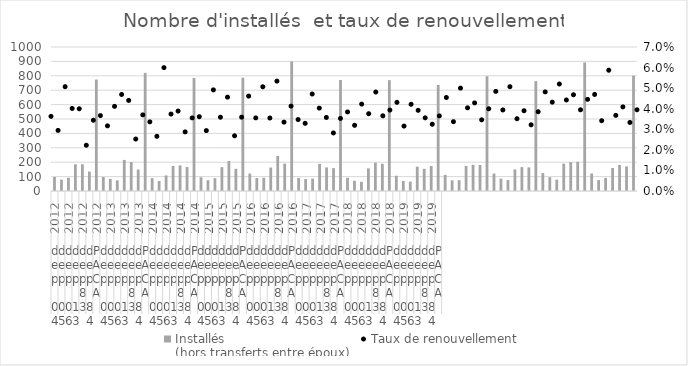
| Category | Installés
(hors transferts entre époux) |
|---|---|
| 0 | 97 |
| 1 | 79 |
| 2 | 92 |
| 3 | 185 |
| 4 | 186 |
| 5 | 135 |
| 6 | 774 |
| 7 | 97 |
| 8 | 84 |
| 9 | 74 |
| 10 | 216 |
| 11 | 201 |
| 12 | 149 |
| 13 | 820 |
| 14 | 89 |
| 15 | 69 |
| 16 | 108 |
| 17 | 174 |
| 18 | 178 |
| 19 | 167 |
| 20 | 785 |
| 21 | 95 |
| 22 | 75 |
| 23 | 89 |
| 24 | 166 |
| 25 | 208 |
| 26 | 154 |
| 27 | 787 |
| 28 | 121 |
| 29 | 90 |
| 30 | 92 |
| 31 | 163 |
| 32 | 243 |
| 33 | 190 |
| 34 | 899 |
| 35 | 91 |
| 36 | 83 |
| 37 | 86 |
| 38 | 188 |
| 39 | 164 |
| 40 | 159 |
| 41 | 771 |
| 42 | 92 |
| 43 | 71 |
| 44 | 64 |
| 45 | 157 |
| 46 | 197 |
| 47 | 189 |
| 48 | 770 |
| 49 | 106 |
| 50 | 70 |
| 51 | 65 |
| 52 | 169 |
| 53 | 154 |
| 54 | 173 |
| 55 | 737 |
| 56 | 112 |
| 57 | 74 |
| 58 | 75 |
| 59 | 174 |
| 60 | 182 |
| 61 | 181 |
| 62 | 797 |
| 63 | 121 |
| 64 | 86 |
| 65 | 76 |
| 66 | 150 |
| 67 | 166 |
| 68 | 164 |
| 69 | 763 |
| 70 | 124 |
| 71 | 96 |
| 72 | 79 |
| 73 | 190 |
| 74 | 201 |
| 75 | 203 |
| 76 | 893 |
| 77 | 122 |
| 78 | 76 |
| 79 | 91 |
| 80 | 160 |
| 81 | 181 |
| 82 | 171 |
| 83 | 801 |